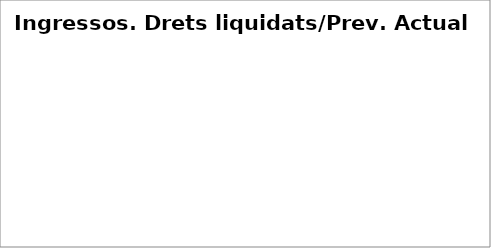
| Category | Series 0 |
|---|---|
| Impostos directes | 0.023 |
| Impostos indirectes | 0.092 |
| Taxes, preus públics i altres ingressos | 0.034 |
| Transferències corrents | 0.079 |
| Ingressos patrimonials | 0.032 |
| Venda d'inversions reals | 0 |
| Transferències de capital | 0 |
| Actius financers* | 0 |
| Passius financers | 0.001 |